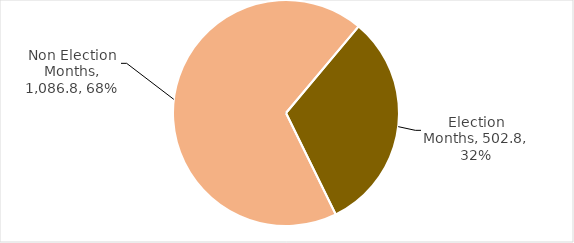
| Category | Total Grants |
|---|---|
| Election Months | 502.766 |
| Non Election Months | 1086.81 |